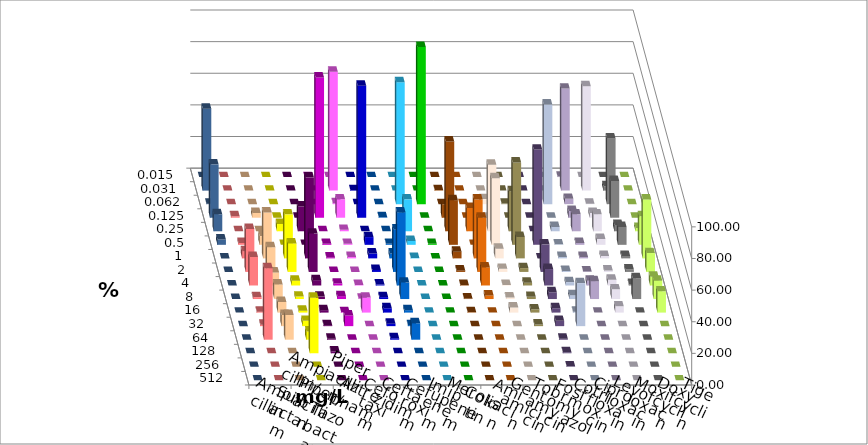
| Category | Ampicillin | Ampicillin/ Sulbactam | Piperacillin | Piperacillin/ Tazobactam | Aztreonam | Cefotaxim | Ceftazidim | Cefuroxim | Imipenem | Meropenem | Colistin | Amikacin | Gentamicin | Tobramycin | Fosfomycin | Cotrimoxazol | Ciprofloxacin | Levofloxacin | Moxifloxacin | Doxycyclin | Tigecyclin |
|---|---|---|---|---|---|---|---|---|---|---|---|---|---|---|---|---|---|---|---|---|---|
| 0.015 | 0 | 0 | 0 | 0 | 0 | 0 | 0 | 0 | 0 | 0 | 0 | 0 | 0 | 0 | 0 | 0 | 0.306 | 0 | 0 | 0 | 0 |
| 0.031 | 0 | 0 | 0 | 0 | 0 | 75.229 | 0.306 | 0 | 0 | 0 | 0.325 | 0 | 0 | 0 | 0 | 0 | 64.526 | 66.055 | 2.752 | 0 | 51.84 |
| 0.062 | 0 | 0 | 0 | 0 | 0 | 0.612 | 0 | 0 | 77.064 | 99.388 | 0 | 0 | 3.236 | 0.347 | 0 | 62.997 | 3.364 | 0.306 | 41.59 | 0 | 0.307 |
| 0.125 | 0.917 | 3.058 | 0 | 0 | 88.685 | 11.621 | 83.486 | 0.306 | 0 | 0 | 8.442 | 0 | 0 | 0 | 0 | 0 | 4.281 | 3.058 | 23.242 | 0 | 33.742 |
| 0.25 | 0 | 0 | 4.587 | 15.644 | 0 | 0.917 | 0 | 0 | 20.183 | 0 | 56.818 | 14.706 | 42.071 | 25.347 | 0 | 2.752 | 10.703 | 10.703 | 3.976 | 2.141 | 10.736 |
| 0.5 | 1.223 | 5.505 | 0 | 0 | 0.612 | 0.612 | 4.893 | 0.612 | 2.446 | 0.612 | 28.247 | 0 | 42.071 | 52.083 | 60.245 | 0.306 | 1.223 | 3.67 | 11.315 | 18.043 | 3.374 |
| 1.0 | 4.587 | 29.052 | 27.829 | 51.227 | 0.612 | 0.917 | 3.058 | 3.058 | 0.306 | 0 | 4.221 | 37.255 | 6.149 | 13.542 | 0 | 0.917 | 0.917 | 1.529 | 1.529 | 37.309 | 0 |
| 2.0 | 27.217 | 15.596 | 18.043 | 24.233 | 0 | 0 | 1.223 | 26.911 | 0 | 0 | 0.974 | 34.314 | 1.942 | 2.431 | 17.431 | 0.612 | 0.306 | 0.917 | 1.529 | 11.927 | 0 |
| 4.0 | 18.043 | 8.257 | 3.058 | 3.374 | 1.223 | 0.306 | 0.612 | 46.177 | 0 | 0 | 0.325 | 11.438 | 0.324 | 1.736 | 10.398 | 2.141 | 3.058 | 3.67 | 0.917 | 5.505 | 0 |
| 8.0 | 1.223 | 9.174 | 1.529 | 1.534 | 1.835 | 0.306 | 1.223 | 10.398 | 0 | 0 | 0.325 | 2.288 | 0.971 | 1.389 | 4.281 | 2.446 | 11.315 | 6.116 | 13.15 | 11.621 | 0 |
| 16.0 | 0.612 | 6.728 | 1.223 | 1.534 | 0.306 | 9.48 | 2.752 | 1.529 | 0 | 0 | 0.325 | 0 | 3.236 | 2.083 | 2.752 | 0.612 | 0 | 3.976 | 0 | 13.456 | 0 |
| 32.0 | 0.917 | 7.034 | 3.364 | 0.613 | 6.728 | 0 | 1.529 | 0.612 | 0 | 0 | 0 | 0 | 0 | 1.042 | 3.364 | 27.217 | 0 | 0 | 0 | 0 | 0 |
| 64.0 | 45.26 | 15.596 | 5.199 | 0.613 | 0 | 0 | 0.917 | 10.398 | 0 | 0 | 0 | 0 | 0 | 0 | 0.612 | 0 | 0 | 0 | 0 | 0 | 0 |
| 128.0 | 0 | 0 | 35.168 | 1.227 | 0 | 0 | 0 | 0 | 0 | 0 | 0 | 0 | 0 | 0 | 0.612 | 0 | 0 | 0 | 0 | 0 | 0 |
| 256.0 | 0 | 0 | 0 | 0 | 0 | 0 | 0 | 0 | 0 | 0 | 0 | 0 | 0 | 0 | 0.306 | 0 | 0 | 0 | 0 | 0 | 0 |
| 512.0 | 0 | 0 | 0 | 0 | 0 | 0 | 0 | 0 | 0 | 0 | 0 | 0 | 0 | 0 | 0 | 0 | 0 | 0 | 0 | 0 | 0 |